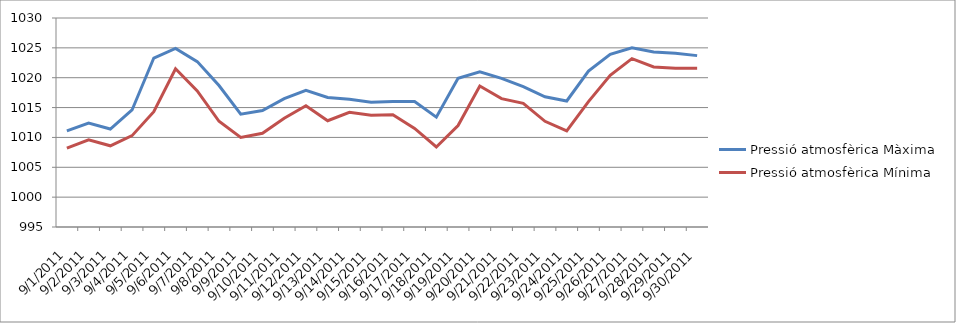
| Category | Pressió atmosfèrica Màxima | Pressió atmosfèrica Mínima |
|---|---|---|
| 01/09/2011 | 1011.1 | 1008.2 |
| 02/09/2011 | 1012.4 | 1009.6 |
| 03/09/2011 | 1011.4 | 1008.6 |
| 04/09/2011 | 1014.6 | 1010.3 |
| 05/09/2011 | 1023.3 | 1014.3 |
| 06/09/2011 | 1024.9 | 1021.5 |
| 07/09/2011 | 1022.7 | 1017.8 |
| 08/09/2011 | 1018.7 | 1012.7 |
| 09/09/2011 | 1013.9 | 1010 |
| 10/09/2011 | 1014.5 | 1010.7 |
| 11/09/2011 | 1016.5 | 1013.2 |
| 12/09/2011 | 1017.9 | 1015.3 |
| 13/09/2011 | 1016.7 | 1012.8 |
| 14/09/2011 | 1016.4 | 1014.2 |
| 15/09/2011 | 1015.9 | 1013.7 |
| 16/09/2011 | 1016 | 1013.8 |
| 17/09/2011 | 1016 | 1011.5 |
| 18/09/2011 | 1013.4 | 1008.4 |
| 19/09/2011 | 1019.9 | 1012 |
| 20/09/2011 | 1021 | 1018.6 |
| 21/09/2011 | 1019.9 | 1016.5 |
| 22/09/2011 | 1018.5 | 1015.7 |
| 23/09/2011 | 1016.8 | 1012.7 |
| 24/09/2011 | 1016.1 | 1011.1 |
| 25/09/2011 | 1021.1 | 1016 |
| 26/09/2011 | 1023.9 | 1020.4 |
| 27/09/2011 | 1025 | 1023.2 |
| 28/09/2011 | 1024.3 | 1021.8 |
| 29/09/2011 | 1024.1 | 1021.6 |
| 30/09/2011 | 1023.7 | 1021.6 |